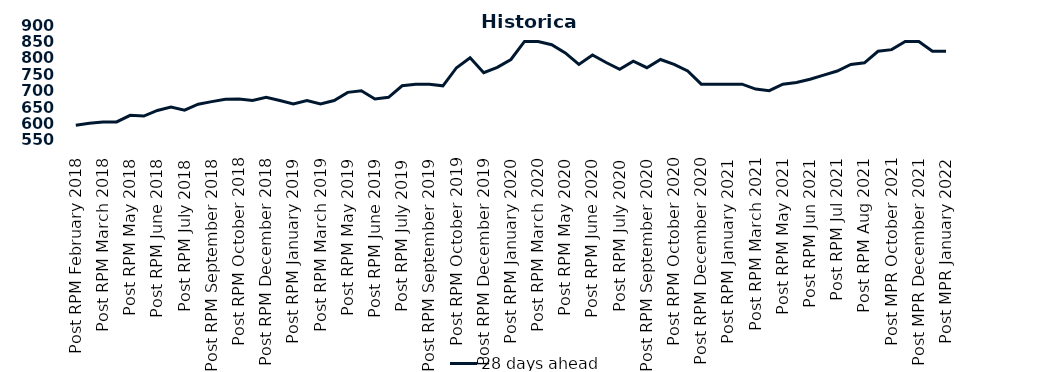
| Category | 28 days ahead |
|---|---|
| Post RPM February 2018 | 595 |
| Pre RPM March 2018 | 601 |
| Post RPM March 2018 | 605 |
| Pre RPM May 2018 | 605 |
| Post RPM May 2018 | 625 |
| Pre RPM June 2018 | 623 |
| Post RPM June 2018 | 640 |
| Pre RPM July 2018 | 650 |
| Post RPM July 2018 | 641 |
| Pre RPM September 2018 | 659 |
| Post RPM September 2018 | 666.75 |
| Pre RPM October 2018 | 674 |
| Post RPM October 2018 | 675 |
| Pre RPM December 2018 | 670 |
| Post RPM December 2018 | 680 |
| Pre RPM January 2019 | 670 |
| Post RPM January 2019 | 660 |
| Pre RPM March 2019 | 670 |
| Post RPM March 2019 | 660 |
| Pre RPM May 2019 | 670 |
| Post RPM May 2019 | 695 |
| Pre RPM June 2019 | 700 |
| Post RPM June 2019 | 675 |
| Pre RPM July 2019 | 680 |
| Post RPM July 2019 | 715 |
| Pre RPM September 2019 | 720 |
| Post RPM September 2019 | 720 |
| Pre RPM October 2019 | 715 |
| Post RPM October 2019 | 770 |
| Pre RPM December 2019 | 800 |
| Post RPM December 2019 | 755 |
| Pre RPM January 2020 | 771 |
| Post RPM January 2020 | 795 |
| Pre RPM March 2020 | 850 |
| Post RPM March 2020 | 850 |
| Pre RPM May 2020 | 840 |
| Post RPM May 2020 | 815 |
| Pre RPM June 2020 | 780 |
| Post RPM June 2020 | 809 |
| Pre RPM July 2020 | 785.72 |
| Post RPM July 2020 | 765 |
| Pre RPM September 2020 | 790 |
| Post RPM September 2020 | 770 |
| Pre RPM October 2020 | 795 |
| Post RPM October 2020 | 780 |
| Pre RPM December 2020 | 760 |
|  Post RPM December 2020 | 720 |
| Pre RPM January 2021 | 720 |
| Post RPM January 2021 | 720 |
|  Pre RPM March 2021 | 720 |
|  Post RPM March 2021 | 705 |
|  Pre RPM May 2021 | 700 |
|  Post RPM May 2021 | 720 |
|  Pre RPM Jun 2021 | 725 |
|   Post RPM Jun 2021 | 735 |
| Pre RPM Jul 2021 | 747.5 |
|  Post RPM Jul 2021 | 760 |
| Pre RPM Aug 2021 | 780 |
|  Post RPM Aug 2021 | 785 |
| Pre MPR October 2021 | 820 |
| Post MPR October 2021 | 825 |
| Pre MPR December 2021 | 850 |
| Post MPR December 2021 | 850 |
| Pre MPR January 2022 | 820 |
| Post MPR January 2022 | 820 |